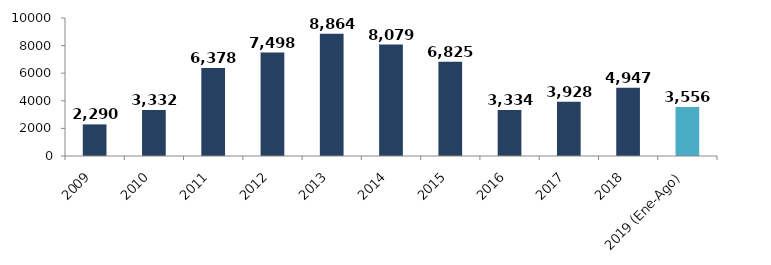
| Category | Series 0 |
|---|---|
| 2009 | 2290.273 |
| 2010 | 3331.554 |
| 2011 | 6377.615 |
| 2012 | 7498.207 |
| 2013 | 8863.622 |
| 2014 | 8079.21 |
| 2015 | 6824.624 |
| 2016 | 3333.564 |
| 2017 | 3928.017 |
| 2018 | 4947.435 |
| 2019 (Ene-Ago) | 3556.361 |